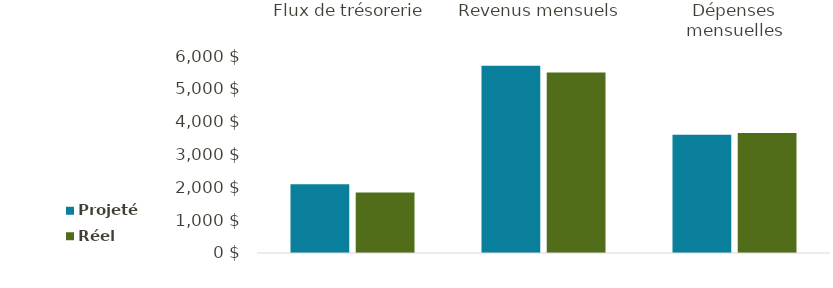
| Category | Projeté | Réel |
|---|---|---|
| Flux de trésorerie | 2097 | 1845 |
| Revenus mensuels | 5700 | 5500 |
| Dépenses mensuelles | 3603 | 3655 |